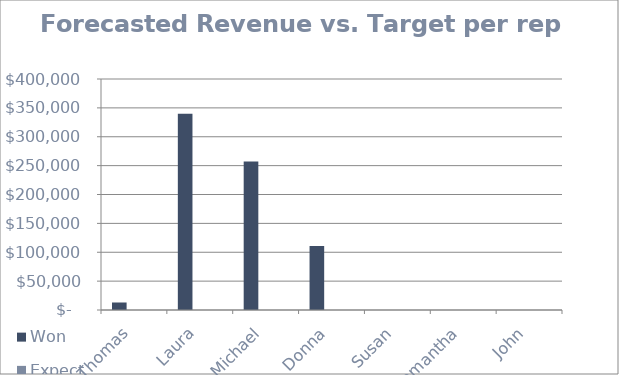
| Category | Won | Expected | Target |
|---|---|---|---|
| Thomas | 13000 | 114250 | 100000 |
| Laura | 340000 | 409250 | 75000 |
| Michael | 257000 | 260350 | 75000 |
| Donna | 111000 | 242550 | 125000 |
| Susan | 0 | 48500 | 100000 |
| Samantha | 0 | 39500 | 75000 |
| John | 0 | 0 | 50000 |